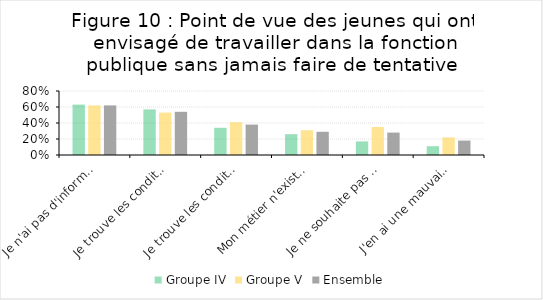
| Category | Groupe IV | Groupe V | Ensemble |
|---|---|---|---|
| Je n'ai pas d'information sur les opportunités de carrière | 0.63 | 0.62 | 0.62 |
| Je trouve les conditions de candidature trop compliquées | 0.57 | 0.53 | 0.54 |
| Je trouve les conditions de travail ou de salaire peu attractives | 0.34 | 0.41 | 0.38 |
| Mon métier n'existe pas | 0.26 | 0.31 | 0.29 |
| Je ne souhaite pas y faire carrière | 0.17 | 0.35 | 0.28 |
| J'en ai une mauvaise image | 0.11 | 0.22 | 0.18 |